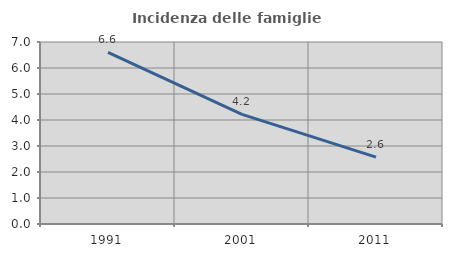
| Category | Incidenza delle famiglie numerose |
|---|---|
| 1991.0 | 6.599 |
| 2001.0 | 4.219 |
| 2011.0 | 2.57 |